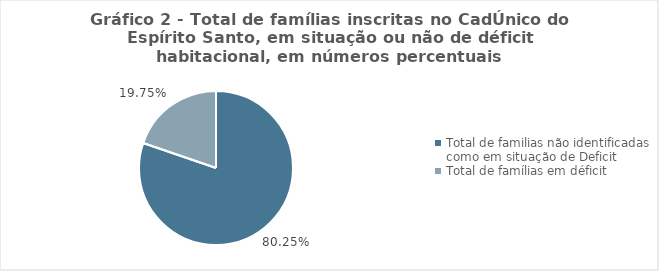
| Category | Series 0 |
|---|---|
| Total de familias não identificadas como em situação de Deficit | 0.802 |
| Total de famílias em déficit | 0.198 |